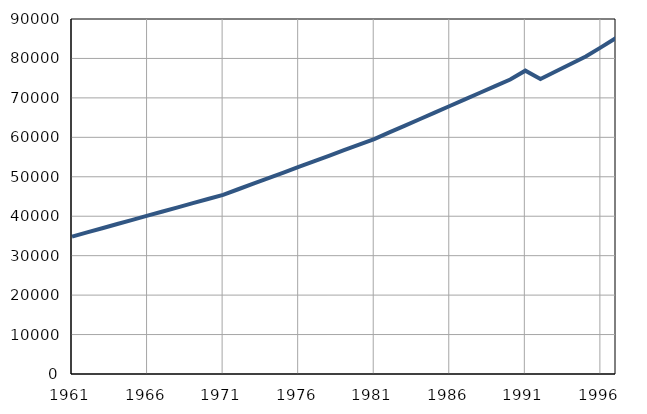
| Category | Број
становника |
|---|---|
| 1961.0 | 34844 |
| 1962.0 | 35902 |
| 1963.0 | 36960 |
| 1964.0 | 38018 |
| 1965.0 | 39076 |
| 1966.0 | 40134 |
| 1967.0 | 41192 |
| 1968.0 | 42250 |
| 1969.0 | 43308 |
| 1970.0 | 44366 |
| 1971.0 | 45424 |
| 1972.0 | 46838 |
| 1973.0 | 48252 |
| 1974.0 | 49666 |
| 1975.0 | 51080 |
| 1976.0 | 52494 |
| 1977.0 | 53908 |
| 1978.0 | 55322 |
| 1979.0 | 56736 |
| 1980.0 | 58150 |
| 1981.0 | 59567 |
| 1982.0 | 61243 |
| 1983.0 | 62919 |
| 1984.0 | 64595 |
| 1985.0 | 66271 |
| 1986.0 | 67947 |
| 1987.0 | 69623 |
| 1988.0 | 71299 |
| 1989.0 | 72975 |
| 1990.0 | 74651 |
| 1991.0 | 76900 |
| 1992.0 | 74800 |
| 1993.0 | 76700 |
| 1994.0 | 78600 |
| 1995.0 | 80500 |
| 1996.0 | 82800 |
| 1997.0 | 85200 |